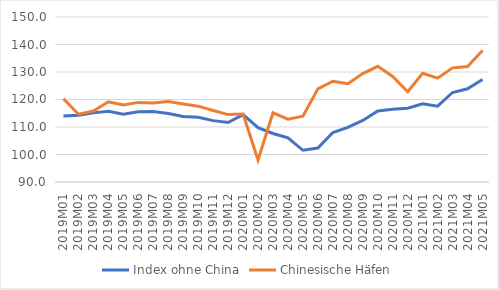
| Category | Index ohne China | Chinesische Häfen |
|---|---|---|
| 2019M01 | 113.979 | 120.247 |
| 2019M02 | 114.264 | 114.653 |
| 2019M03 | 115.139 | 115.824 |
| 2019M04 | 115.716 | 119.166 |
| 2019M05 | 114.64 | 117.981 |
| 2019M06 | 115.542 | 118.952 |
| 2019M07 | 115.636 | 118.762 |
| 2019M08 | 114.872 | 119.28 |
| 2019M09 | 113.85 | 118.367 |
| 2019M10 | 113.518 | 117.576 |
| 2019M11 | 112.316 | 116.013 |
| 2019M12 | 111.632 | 114.505 |
| 2020M01 | 114.522 | 114.704 |
| 2020M02 | 109.771 | 97.987 |
| 2020M03 | 107.649 | 115.165 |
| 2020M04 | 106.041 | 112.868 |
| 2020M05 | 101.533 | 113.922 |
| 2020M06 | 102.364 | 123.894 |
| 2020M07 | 107.981 | 126.657 |
| 2020M08 | 109.886 | 125.774 |
| 2020M09 | 112.397 | 129.44 |
| 2020M10 | 115.85 | 132.066 |
| 2020M11 | 116.461 | 128.385 |
| 2020M12 | 116.85 | 122.825 |
| 2021M01 | 118.414 | 129.52 |
| 2021M02 | 117.584 | 127.765 |
| 2021M03 | 122.54 | 131.514 |
| 2021M04 | 123.882 | 132.021 |
| 2021M05 | 127.251 | 137.82 |